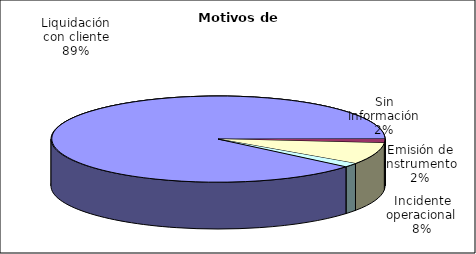
| Category | Motivos |
|---|---|
| Liquidación con cliente | 532 |
| Emisión de instrumento | 9 |
| Incidente operacional | 49 |
| Sin información | 9 |